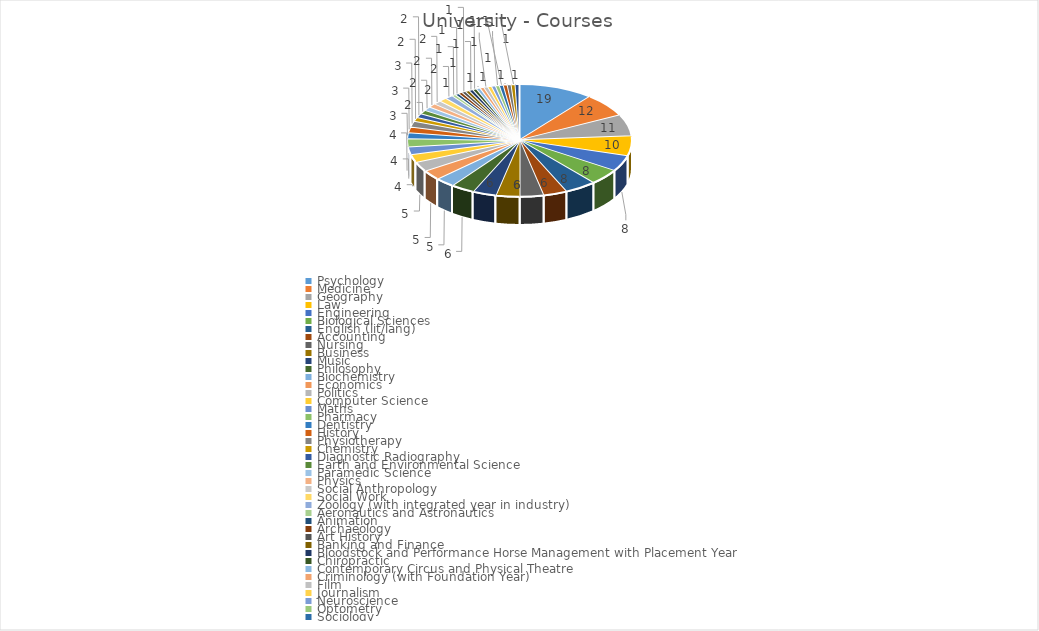
| Category | Series 0 |
|---|---|
| Psychology | 19 |
| Medicine | 12 |
| Geography | 11 |
| Law | 10 |
| Engineering | 8 |
| Biological Sciences | 8 |
| English (lit/lang) | 8 |
| Accounting | 6 |
| Nursing | 6 |
| Business | 6 |
| Music | 6 |
| Philosophy | 6 |
| Biochemistry | 5 |
| Economics | 5 |
| Politics | 5 |
| Computer Science | 4 |
| Maths | 4 |
| Pharmacy | 4 |
| Dentistry | 3 |
| History | 3 |
| Physiotherapy | 3 |
| Chemistry | 2 |
| Diagnostic Radiography | 2 |
| Earth and Environmental Science | 2 |
| Paramedic Science | 2 |
| Physics | 2 |
| Social Anthropology | 2 |
| Social Work | 2 |
| Zoology (with integrated year in industry) | 2 |
| Aeronautics and Astronautics | 1 |
| Animation | 1 |
| Archaeology | 1 |
| Art History | 1 |
| Banking and Finance | 1 |
| Bloodstock and Performance Horse Management with Placement Year | 1 |
| Chiropractic | 1 |
| Contemporary Circus and Physical Theatre | 1 |
| Criminology (with Foundation Year) | 1 |
| Film | 1 |
| Journalism | 1 |
| Neuroscience | 1 |
| Optometry | 1 |
| Sociology | 1 |
| Sport and Exercise Science | 1 |
| Thai Studies | 1 |
| Veterinary Science | 1 |
| Visual Effects (VFX) for Film and Television | 1 |